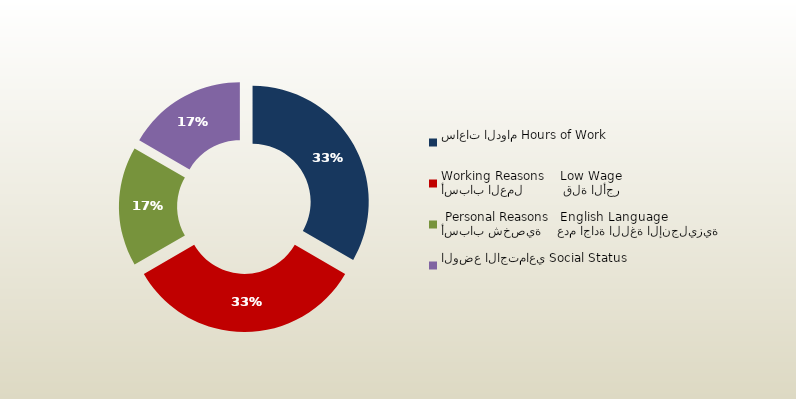
| Category | المجموع
Total |
|---|---|
| ساعات الدوام Hours of Work | 122 |
| أسباب العمل          قلة الأجر
Working Reasons    Low Wage | 122 |
| أسباب شخصية    عدم اجادة اللغة الإنجليزية
 Personal Reasons   English Language | 61 |
| الوضع الاجتماعي Social Status | 61 |